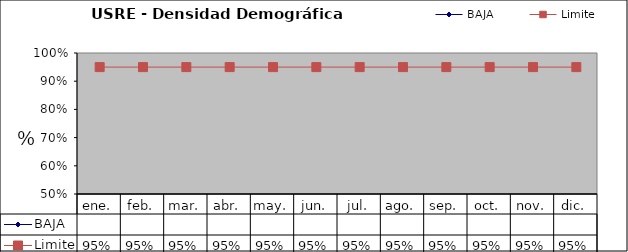
| Category | BAJA | Limite |
|---|---|---|
| ene. |  | 0.95 |
| feb. |  | 0.95 |
| mar. |  | 0.95 |
| abr. |  | 0.95 |
| may. |  | 0.95 |
| jun. |  | 0.95 |
| jul. |  | 0.95 |
| ago. |  | 0.95 |
| sep. |  | 0.95 |
| oct. |  | 0.95 |
| nov. |  | 0.95 |
| dic. |  | 0.95 |